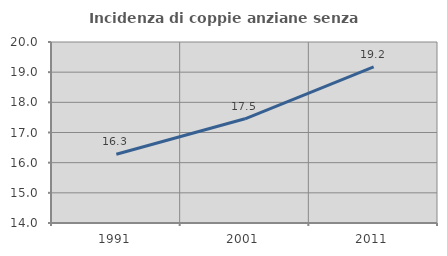
| Category | Incidenza di coppie anziane senza figli  |
|---|---|
| 1991.0 | 16.279 |
| 2001.0 | 17.455 |
| 2011.0 | 19.173 |